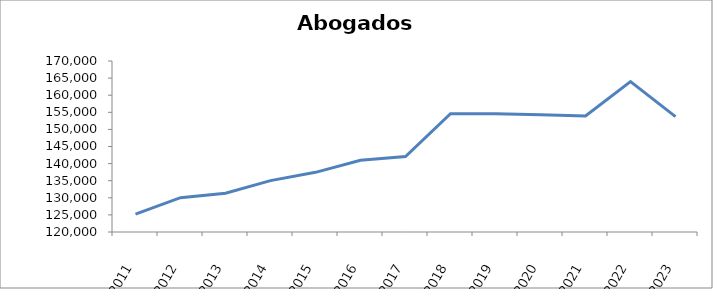
| Category | Series 1 |
|---|---|
| 2011.0 | 125208 |
| 2012.0 | 130038 |
| 2013.0 | 131337 |
| 2014.0 | 135016 |
| 2015.0 | 137447 |
| 2016.0 | 140973 |
| 2017.0 | 142061 |
| 2018.0 | 154573 |
| 2019.0 | 154583 |
| 2020.0 | 154296 |
| 2021.0 | 153913 |
| 2022.0 | 163986 |
| 2023.0 | 153753 |